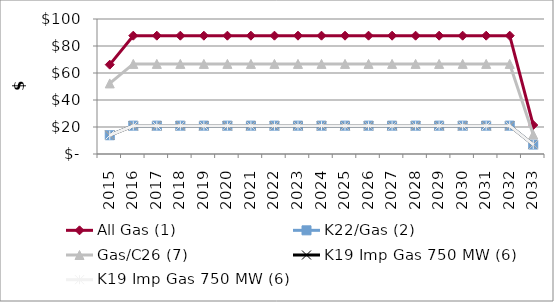
| Category | All Gas (1) | K22/Gas (2) | Gas/C26 (7) | K19 Imp Gas 750 MW (6) |
|---|---|---|---|---|
| 2015.0 | 66.17 | 13.9 | 52.27 | 13.9 |
| 2016.0 | 87.64 | 21 | 66.74 | 20.9 |
| 2017.0 | 87.64 | 21 | 66.74 | 20.9 |
| 2018.0 | 87.64 | 21 | 66.74 | 20.9 |
| 2019.0 | 87.64 | 21 | 66.74 | 20.9 |
| 2020.0 | 87.64 | 21 | 66.74 | 20.9 |
| 2021.0 | 87.64 | 21 | 66.74 | 20.9 |
| 2022.0 | 87.64 | 21 | 66.74 | 20.9 |
| 2023.0 | 87.64 | 21 | 66.74 | 20.9 |
| 2024.0 | 87.64 | 21 | 66.74 | 20.9 |
| 2025.0 | 87.64 | 21 | 66.74 | 20.9 |
| 2026.0 | 87.64 | 21 | 66.74 | 20.9 |
| 2027.0 | 87.64 | 21 | 66.74 | 20.9 |
| 2028.0 | 87.64 | 21 | 66.74 | 20.9 |
| 2029.0 | 87.64 | 21 | 66.74 | 20.9 |
| 2030.0 | 87.64 | 21 | 66.74 | 20.9 |
| 2031.0 | 87.64 | 21 | 66.74 | 20.9 |
| 2032.0 | 87.64 | 21 | 66.74 | 20.9 |
| 2033.0 | 21.46 | 7 | 14.46 | 7 |